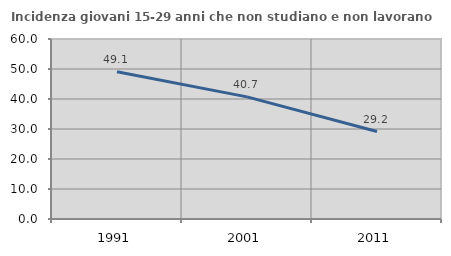
| Category | Incidenza giovani 15-29 anni che non studiano e non lavorano  |
|---|---|
| 1991.0 | 49.112 |
| 2001.0 | 40.711 |
| 2011.0 | 29.167 |